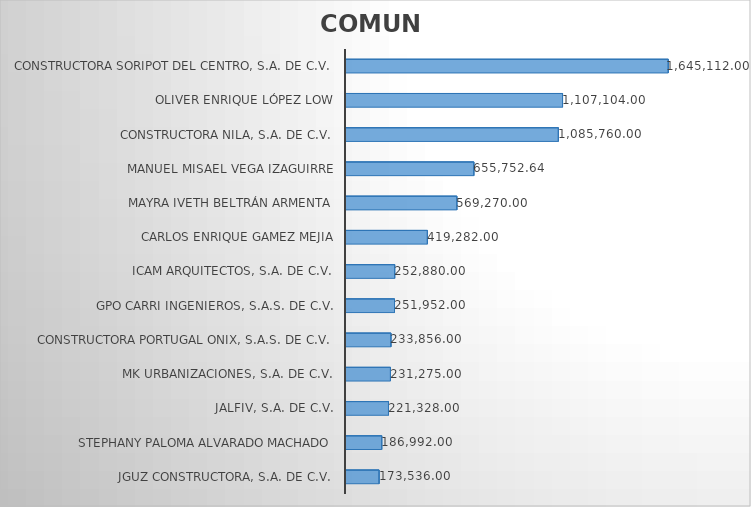
| Category | Suma |
|---|---|
| JGUZ Constructora, S.A. de C.V. | 173536 |
| Stephany Paloma Alvarado Machado | 186992 |
| Jalfiv, S.A. de C.V. | 221328 |
| MK Urbanizaciones, S.A. de C.V. | 231275 |
| Constructora Portugal ONIX, S.A.S. de C.V. | 233856 |
| GPO CARRI Ingenieros, S.A.S. DE C.V. | 251952 |
| Icam Arquitectos, S.A. de C.V. | 252880 |
| Carlos Enrique Gamez Mejia | 419282 |
| Mayra Iveth Beltrán Armenta | 569270 |
| Manuel Misael Vega Izaguirre | 655752.64 |
| Constructora Nila, S.A. de C.V. | 1085760 |
| Oliver Enrique López Low | 1107104 |
| Constructora Soripot del Centro, S.A. de C.V. | 1645112 |